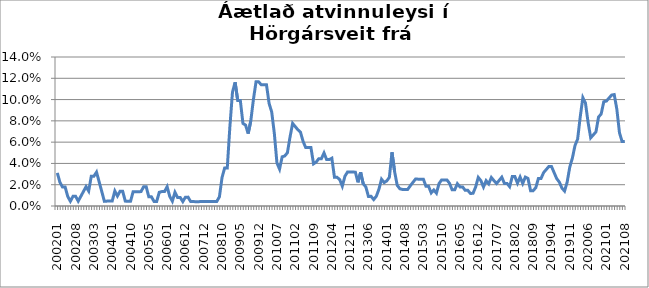
| Category | Series 0 |
|---|---|
| 200201 | 0.031 |
| 200202 | 0.022 |
| 200203 | 0.018 |
| 200204 | 0.018 |
| 200205 | 0.009 |
| 200206 | 0.004 |
| 200207 | 0.009 |
| 200208 | 0.009 |
| 200209 | 0.005 |
| 200210 | 0.009 |
| 200211 | 0.014 |
| 200212 | 0.018 |
| 200301 | 0.014 |
| 200302 | 0.028 |
| 200303 | 0.028 |
| 200304 | 0.032 |
| 200305 | 0.023 |
| 200306 | 0.014 |
| 200307 | 0.004 |
| 200311 | 0.005 |
| 200312 | 0.005 |
| 200401 | 0.005 |
| 200402 | 0.014 |
| 200403 | 0.009 |
| 200404 | 0.014 |
| 200405 | 0.014 |
| 200406 | 0.005 |
| 200409 | 0.004 |
| 200410 | 0.004 |
| 200411 | 0.013 |
| 200412 | 0.013 |
| 200501 | 0.013 |
| 200502 | 0.014 |
| 200503 | 0.018 |
| 200504 | 0.018 |
| 200505 | 0.009 |
| 200506 | 0.009 |
| 200507 | 0.004 |
| 200508 | 0.004 |
| 200510 | 0.013 |
| 200511 | 0.014 |
| 200512 | 0.014 |
| 200601 | 0.018 |
| 200602 | 0.009 |
| 200603 | 0.005 |
| 200606 | 0.013 |
| 200607 | 0.008 |
| 200608 | 0.008 |
| 200611 | 0.004 |
| 200612 | 0.008 |
| 200701 | 0.008 |
| 200702 | 0.004 |
| 200703 | 0.004 |
| 200704 | 0.004 |
| 200706 | 0.004 |
| 200711 | 0.004 |
| 200712 | 0.004 |
| 200801 | 0.004 |
| 200802 | 0.004 |
| 200803 | 0.004 |
| 200807 | 0.004 |
| 200808 | 0.004 |
| 200809 | 0.009 |
| 200810 | 0.027 |
| 200811 | 0.036 |
| 200812 | 0.036 |
| 200901 | 0.074 |
| 200902 | 0.107 |
| 200903 | 0.116 |
| 200904 | 0.099 |
| 200905 | 0.099 |
| 200906 | 0.078 |
| 200907 | 0.076 |
| 200908 | 0.068 |
| 200909 | 0.08 |
| 200910 | 0.1 |
| 200911 | 0.117 |
| 200912 | 0.117 |
| 201001 | 0.114 |
| 201002 | 0.114 |
| 201003 | 0.114 |
| 201004 | 0.096 |
| 201005 | 0.088 |
| 201006 | 0.068 |
| 201007 | 0.04 |
| 201008 | 0.035 |
| 201009 | 0.046 |
| 201010 | 0.047 |
| 201011 | 0.05 |
| 201012 | 0.065 |
| 201101 | 0.078 |
| 201102 | 0.075 |
| 201103 | 0.072 |
| 201104 | 0.069 |
| 201105 | 0.061 |
| 201106 | 0.055 |
| 201107 | 0.055 |
| 201108 | 0.055 |
| 201109 | 0.04 |
| 201110 | 0.041 |
| 201111 | 0.044 |
| 201112 | 0.044 |
| 201201 | 0.05 |
| 201202 | 0.044 |
| 201203 | 0.044 |
| 201204 | 0.045 |
| 201205 | 0.027 |
| 201206 | 0.027 |
| 201207 | 0.025 |
| 201208 | 0.019 |
| 201209 | 0.028 |
| 201210 | 0.032 |
| 201211 | 0.032 |
| 201212 | 0.032 |
| 201301 | 0.032 |
| 201302 | 0.022 |
| 201303 | 0.032 |
| 201304 | 0.021 |
| 201305 | 0.018 |
| 201306 | 0.009 |
| 201307 | 0.009 |
| 201308 | 0.006 |
| 201309 | 0.009 |
| 201310 | 0.016 |
| 201311 | 0.025 |
| 201312 | 0.022 |
| 201401 | 0.024 |
| 201402 | 0.027 |
| 201403 | 0.051 |
| 201404 | 0.032 |
| 201405 | 0.019 |
| 201406 | 0.016 |
| 201407 | 0.016 |
| 201408 | 0.016 |
| 201409 | 0.016 |
| 201410 | 0.019 |
| 201411 | 0.022 |
| 201412 | 0.025 |
| 201501 | 0.025 |
| 201502 | 0.025 |
| 201503 | 0.025 |
| 201504 | 0.018 |
| 201505 | 0.018 |
| 201506 | 0.012 |
| 201507 | 0.015 |
| 201508 | 0.012 |
| 201509 | 0.021 |
| 201510 | 0.025 |
| 201511 | 0.025 |
| 201512 | 0.025 |
| 201601 | 0.021 |
| 201602 | 0.015 |
| 201603 | 0.015 |
| 201604 | 0.021 |
| 201605 | 0.018 |
| 201606 | 0.018 |
| 201607 | 0.015 |
| 201608 | 0.015 |
| 201609 | 0.012 |
| 201610 | 0.012 |
| 201611 | 0.018 |
| 201612 | 0.027 |
| 201701 | 0.024 |
| 201702 | 0.018 |
| 201703 | 0.024 |
| 201704 | 0.021 |
| 201705 | 0.027 |
| 201706 | 0.024 |
| 201707 | 0.021 |
| 201708 | 0.024 |
| 201709 | 0.027 |
| 201710 | 0.021 |
| 201711 | 0.021 |
| 201712 | 0.018 |
| 201801 | 0.028 |
| 201802 | 0.028 |
| 201803 | 0.021 |
| 201804 | 0.027 |
| 201805 | 0.021 |
| 201806 | 0.027 |
| 201807 | 0.026 |
| 201808 | 0.014 |
| 201809 | 0.014 |
| 201810 | 0.017 |
| 201811 | 0.026 |
| 201812 | 0.026 |
| 201901 | 0.031 |
| 201902 | 0.034 |
| 201903 | 0.037 |
| 201904 | 0.037 |
| 201905 | 0.031 |
| 201906 | 0.026 |
| 201907 | 0.022 |
| 201908 | 0.017 |
| 201909 | 0.014 |
| 201910 | 0.023 |
| 201911 | 0.037 |
| 201912 | 0.045 |
| 202001 | 0.057 |
| 202002 | 0.063 |
| 202003 | 0.084 |
| 202004 | 0.102 |
| 202005 | 0.097 |
| 202006 | 0.079 |
| 202007 | 0.064 |
| 202008 | 0.067 |
| 202009 | 0.07 |
| 202010 | 0.084 |
| 202011 | 0.086 |
| 202012 | 0.098 |
| 202101 | 0.099 |
| 202102 | 0.101 |
| 202103 | 0.104 |
| 202104 | 0.105 |
| 202105 | 0.091 |
| 202106 | 0.069 |
| 202107 | 0.061 |
| 202108 | 0.061 |